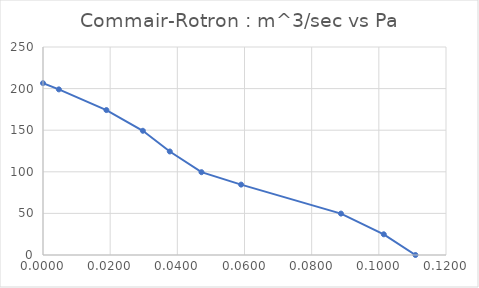
| Category | Series 0 |
|---|---|
| 0.0 | 206.537 |
| 0.0047194745 | 199.072 |
| 0.018877898 | 174.188 |
| 0.02973268935 | 149.304 |
| 0.037755796 | 124.42 |
| 0.047194745 | 99.536 |
| 0.05899343125 | 84.606 |
| 0.0887261206 | 49.768 |
| 0.10146870175 | 24.884 |
| 0.11090765075 | 0 |